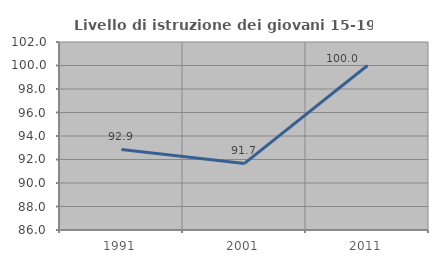
| Category | Livello di istruzione dei giovani 15-19 anni |
|---|---|
| 1991.0 | 92.857 |
| 2001.0 | 91.667 |
| 2011.0 | 100 |